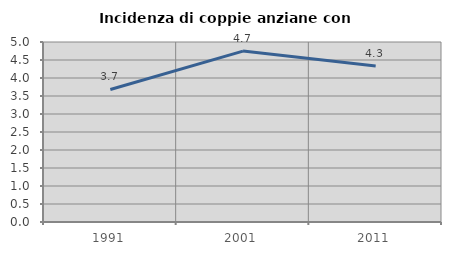
| Category | Incidenza di coppie anziane con figli |
|---|---|
| 1991.0 | 3.681 |
| 2001.0 | 4.748 |
| 2011.0 | 4.334 |